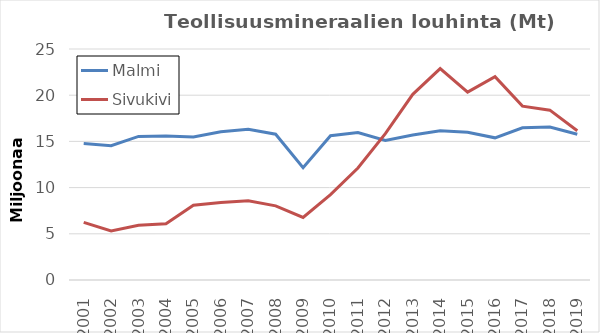
| Category | Malmi | Sivukivi |
|---|---|---|
| 2001.0 | 14777539 | 6240078 |
| 2002.0 | 14535179 | 5308893 |
| 2003.0 | 15538156 | 5916210 |
| 2004.0 | 15579318 | 6079003 |
| 2005.0 | 15479167 | 8088644 |
| 2006.0 | 16033468 | 8395759 |
| 2007.0 | 16301106 | 8569253 |
| 2008.0 | 15774042 | 8020138 |
| 2009.0 | 12156666 | 6771364 |
| 2010.0 | 15609751 | 9243402 |
| 2011.0 | 15967678 | 12117724 |
| 2012.0 | 15093357 | 15830666 |
| 2013.0 | 15687190 | 20094726 |
| 2014.0 | 16141065 | 22884757 |
| 2015.0 | 15985662 | 20332790 |
| 2016.0 | 15385961 | 22004938 |
| 2017.0 | 16466379 | 18818896 |
| 2018.0 | 16546882 | 18382146 |
| 2019.0 | 15774595 | 16154617 |